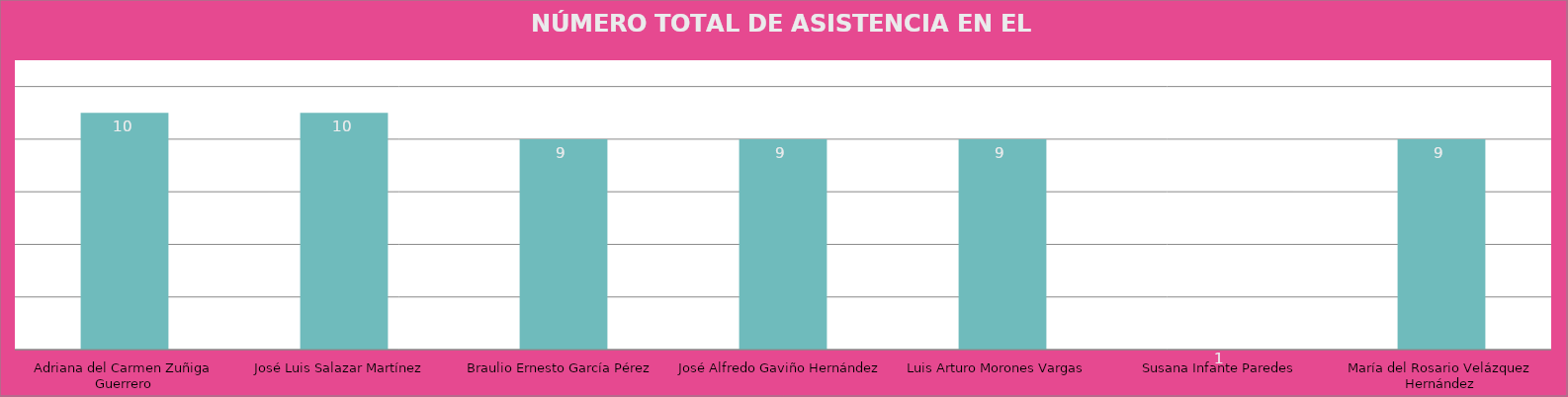
| Category | Adriana del Carmen Zuñiga Guerrero |
|---|---|
| Adriana del Carmen Zuñiga Guerrero | 10 |
| José Luis Salazar Martínez  | 10 |
| Braulio Ernesto García Pérez | 9 |
| José Alfredo Gaviño Hernández | 9 |
| Luis Arturo Morones Vargas  | 9 |
| Susana Infante Paredes | 1 |
| María del Rosario Velázquez Hernández | 9 |